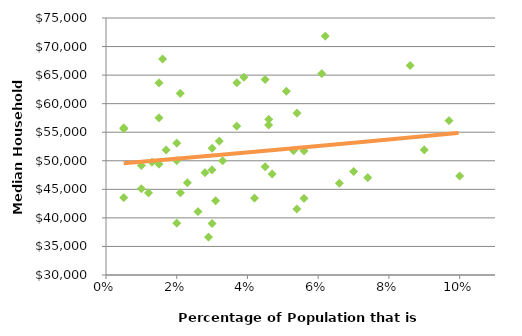
| Category | Series 0 |
|---|---|
| 0.042 | 43464.214 |
| 0.015 | 63647.97 |
| 0.07400000000000001 | 47043.73 |
| 0.03 | 39018.207 |
| 0.09699999999999999 | 57019.523 |
| 0.046 | 57254.884 |
| 0.045 | 64247.281 |
| 0.045 | 48971.893 |
| 0.061 | 65246.2 |
| 0.066 | 46071.019 |
| 0.07 | 48120.925 |
| 0.046 | 56262.527 |
| 0.027999999999999997 | 47921.74 |
| 0.055999999999999994 | 51737.543 |
| 0.023 | 46158.026 |
| 0.032 | 53442.415 |
| 0.033 | 50002.501 |
| 0.026000000000000002 | 41086.49 |
| 0.02 | 39084.677 |
| 0.01 | 49157.959 |
| 0.062 | 71835.585 |
| 0.037000000000000005 | 63655.897 |
| 0.02 | 50014.804 |
| 0.021 | 61794.916 |
| 0.028999999999999998 | 36641.3 |
| 0.013000000000000001 | 49764.262 |
| 0.01 | 45088.434 |
| 0.03 | 52196.224 |
| 0.1 | 47333.251 |
| 0.016 | 67818.752 |
| 0.086 | 66692.485 |
| 0.055999999999999994 | 43424.182 |
| 0.047 | 47680.251 |
| 0.054000000000000006 | 41553.374 |
| 0.005 | 55765.907 |
| 0.012 | 44375.11 |
| 0.03 | 48406.856 |
| 0.053 | 51775.459 |
| 0.017 | 51904.073 |
| 0.037000000000000005 | 56065.314 |
| 0.021 | 44401.061 |
| 0.015 | 49414.798 |
| 0.031 | 42995.045 |
| 0.09 | 51926.141 |
| 0.054000000000000006 | 58341.015 |
| 0.005 | 55581.826 |
| 0.039 | 64631.518 |
| 0.051 | 62186.634 |
| 0.005 | 43553.124 |
| 0.02 | 53079.006 |
| 0.015 | 57512.159 |